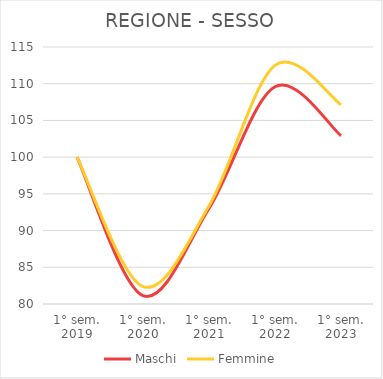
| Category | Maschi | Femmine |
|---|---|---|
| 1° sem.
2019 | 100 | 100 |
| 1° sem.
2020 | 81.138 | 82.378 |
| 1° sem.
2021 | 93.015 | 93.338 |
| 1° sem.
2022 | 109.59 | 112.496 |
| 1° sem.
2023 | 102.921 | 107.132 |